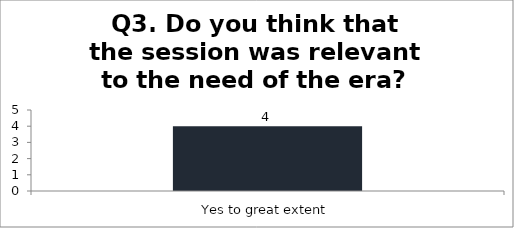
| Category | Q3. Do you think that the session was relevant to the need of the era? |
|---|---|
| Yes to great extent | 4 |